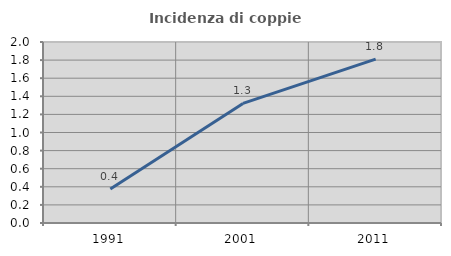
| Category | Incidenza di coppie miste |
|---|---|
| 1991.0 | 0.376 |
| 2001.0 | 1.322 |
| 2011.0 | 1.81 |